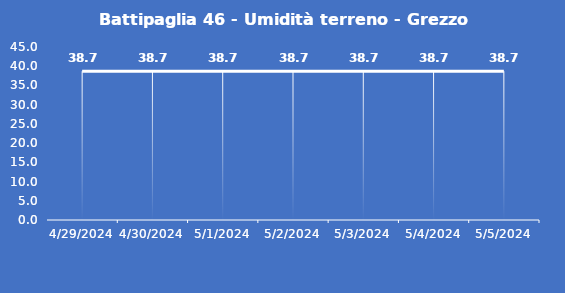
| Category | Battipaglia 46 - Umidità terreno - Grezzo (%VWC) |
|---|---|
| 4/29/24 | 38.7 |
| 4/30/24 | 38.7 |
| 5/1/24 | 38.7 |
| 5/2/24 | 38.7 |
| 5/3/24 | 38.7 |
| 5/4/24 | 38.7 |
| 5/5/24 | 38.7 |